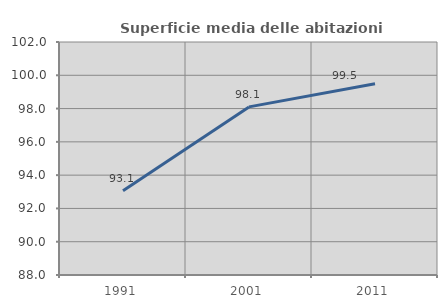
| Category | Superficie media delle abitazioni occupate |
|---|---|
| 1991.0 | 93.055 |
| 2001.0 | 98.101 |
| 2011.0 | 99.489 |